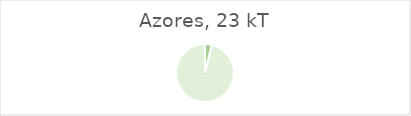
| Category | Azores |
|---|---|
| Landings of assessed stocks for which adequate information is available to determine GES for F and/or SSB | 0 |
| Landings of assessed stocks for which insufficient information is available to determine GES for F and/or SSB | 872.6 |
| Landings unassessed stocks | 22116.37 |